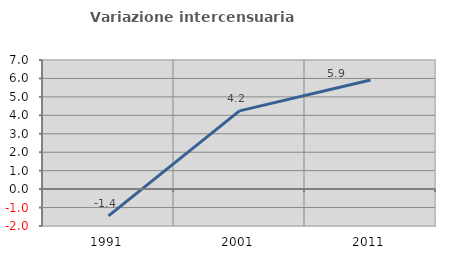
| Category | Variazione intercensuaria annua |
|---|---|
| 1991.0 | -1.448 |
| 2001.0 | 4.243 |
| 2011.0 | 5.914 |